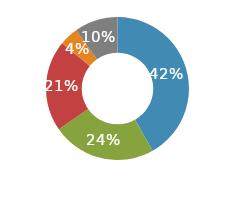
| Category | Series 0 |
|---|---|
| Transportation | 0.418 |
| Lodging | 0.235 |
| Food | 0.206 |
| Entertainment | 0.043 |
| Other | 0.098 |